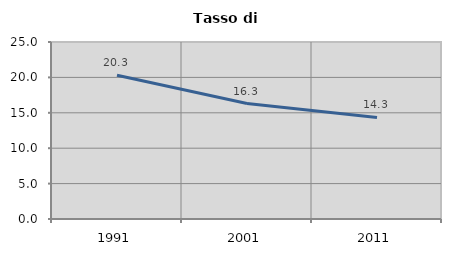
| Category | Tasso di disoccupazione   |
|---|---|
| 1991.0 | 20.301 |
| 2001.0 | 16.307 |
| 2011.0 | 14.342 |